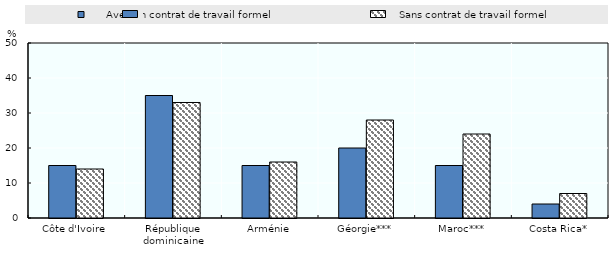
| Category |       Avec un contrat de travail formel |   Sans contrat de travail formel |
|---|---|---|
| Côte d'Ivoire | 15 | 14 |
| République dominicaine | 35 | 33 |
| Arménie | 15 | 16 |
| Géorgie*** | 20 | 28 |
| Maroc*** | 15 | 24 |
| Costa Rica* | 4 | 7 |